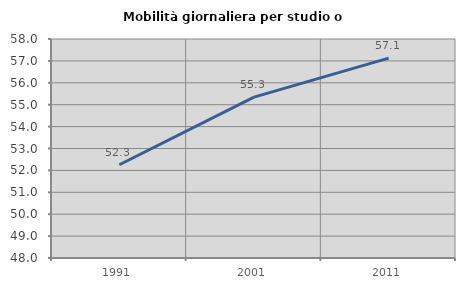
| Category | Mobilità giornaliera per studio o lavoro |
|---|---|
| 1991.0 | 52.258 |
| 2001.0 | 55.347 |
| 2011.0 | 57.128 |